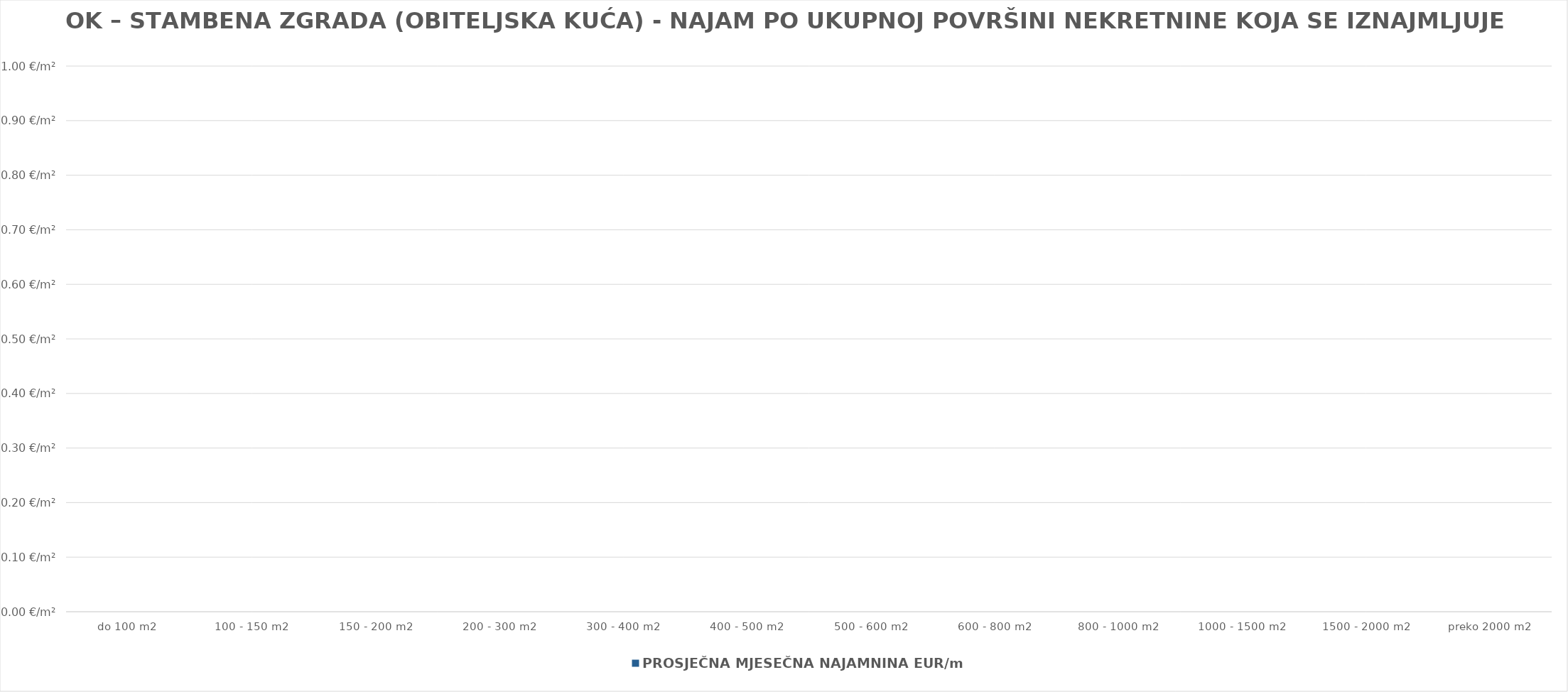
| Category | PROSJEČNA MJESEČNA NAJAMNINA EUR/m2 |
|---|---|
| do 100 m2 | 0 |
| 100 - 150 m2 | 0 |
| 150 - 200 m2 | 0 |
| 200 - 300 m2 | 0 |
| 300 - 400 m2 | 0 |
| 400 - 500 m2 | 0 |
| 500 - 600 m2 | 0 |
| 600 - 800 m2 | 0 |
| 800 - 1000 m2 | 0 |
| 1000 - 1500 m2 | 0 |
| 1500 - 2000 m2 | 0 |
| preko 2000 m2 | 0 |